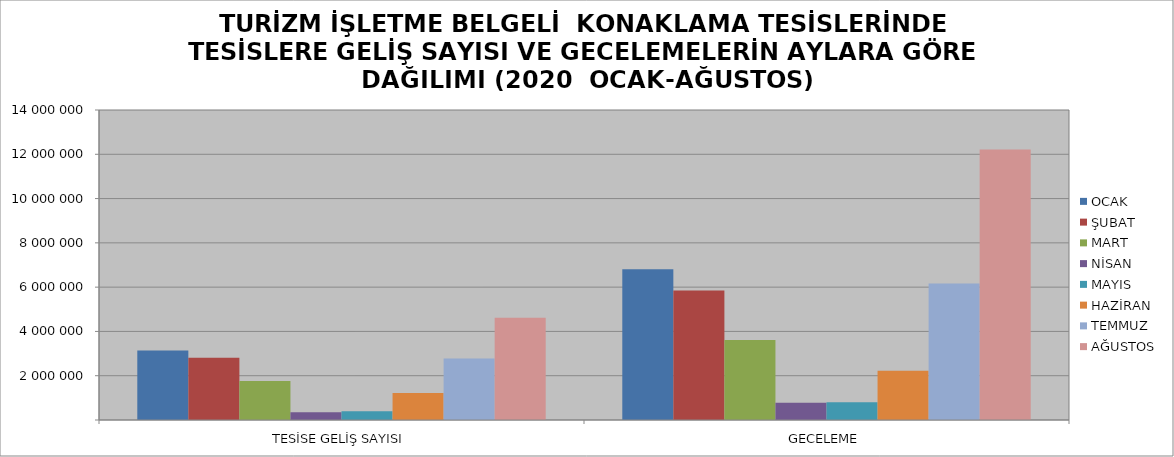
| Category | OCAK | ŞUBAT | MART | NİSAN | MAYIS | HAZİRAN | TEMMUZ | AĞUSTOS |
|---|---|---|---|---|---|---|---|---|
| TESİSE GELİŞ SAYISI | 3140857 | 2816145 | 1756166 | 346964 | 400777 | 1222339 | 2777113 | 4617108 |
| GECELEME | 6806196 | 5853519 | 3616071 | 781724 | 800953 | 2221474 | 6159447 | 12220419 |